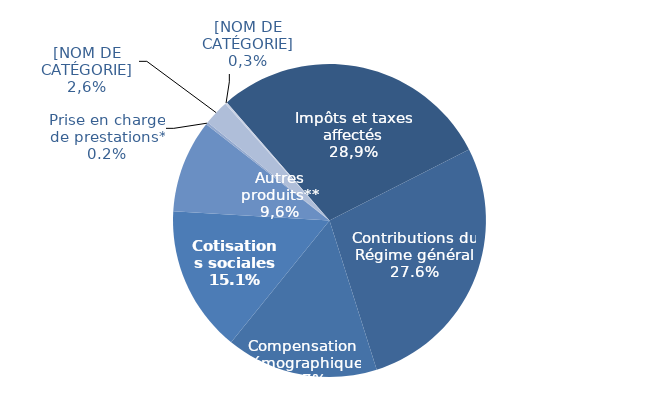
| Category | Series 0 |
|---|---|
| ITAF | 0.289 |
| Contributions du Régime général | 0.276 |
| Compensation démographique | 0.157 |
| Cotisations sociales | 0.151 |
| Autres produits** | 0.096 |
| Prise en charge de prestations* | 0.002 |
| Contribution sociale généralisée | 0.026 |
| Cotisations prises en charge par l'Etat | 0.002 |